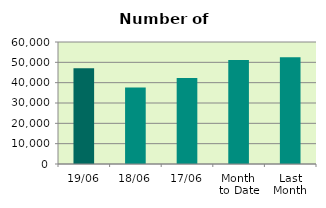
| Category | Series 0 |
|---|---|
| 19/06 | 47140 |
| 18/06 | 37668 |
| 17/06 | 42340 |
| Month 
to Date | 51110.267 |
| Last
Month | 52506.1 |